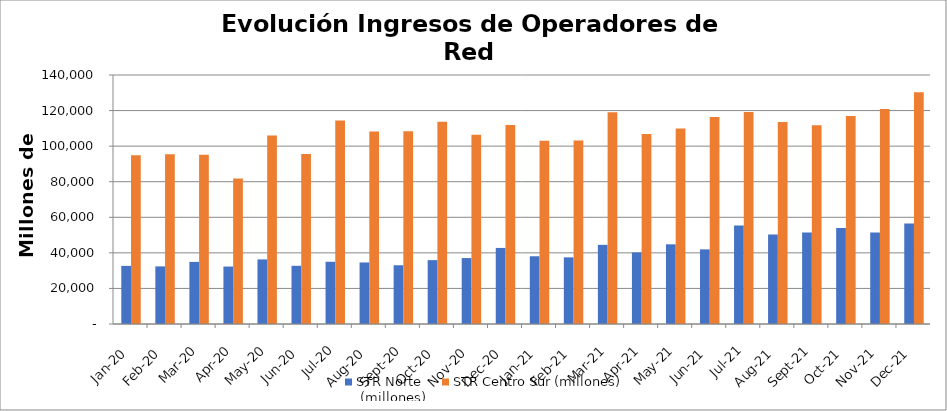
| Category | STR Norte
 (millones) | STR Centro Sur (millones) |
|---|---|---|
| 2020-01-01 | 32670.873 | 94823.111 |
| 2020-02-01 | 32392.514 | 95496.163 |
| 2020-03-01 | 34923.514 | 95211.978 |
| 2020-04-01 | 32303.507 | 81811.734 |
| 2020-05-01 | 36311.16 | 106037.786 |
| 2020-06-01 | 32718.006 | 95521.063 |
| 2020-07-01 | 34987.37 | 114384.947 |
| 2020-08-01 | 34583.763 | 108206.949 |
| 2020-09-01 | 33021.306 | 108363.412 |
| 2020-10-01 | 35903.351 | 113782.218 |
| 2020-11-01 | 37071.245 | 106397.604 |
| 2020-12-01 | 42770.251 | 111820.378 |
| 2021-01-01 | 38082.302 | 103063.136 |
| 2021-02-01 | 37473.307 | 103187.228 |
| 2021-03-01 | 44511.858 | 119012.839 |
| 2021-04-01 | 40215.279 | 106834.088 |
| 2021-05-01 | 44796.109 | 109873.867 |
| 2021-06-01 | 41959.874 | 116448.614 |
| 2021-07-01 | 55370.207 | 119146.984 |
| 2021-08-01 | 50337.902 | 113604.177 |
| 2021-09-01 | 51482.635 | 111773.617 |
| 2021-10-01 | 53928.196 | 116954.306 |
| 2021-11-01 | 51454.612 | 120850.65 |
| 2021-12-01 | 56549.51 | 130255.637 |